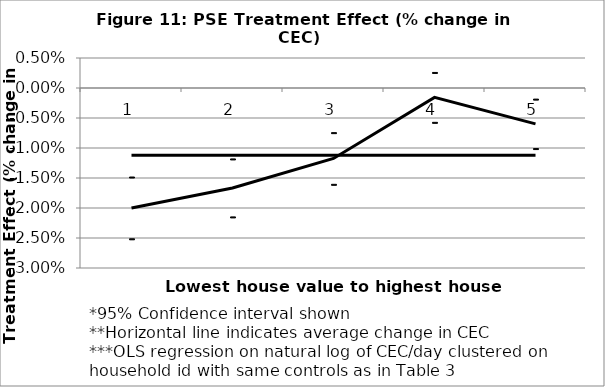
| Category | 1.721422 | 2 SD below | 2 SD above | Avg Reduction |
|---|---|---|---|---|
| 0 | -0.02 | -0.025 | -0.015 | -0.011 |
| 1 | -0.017 | -0.021 | -0.012 | -0.011 |
| 2 | -0.012 | -0.016 | -0.007 | -0.011 |
| 3 | -0.002 | -0.006 | 0.003 | -0.011 |
| 4 | -0.006 | -0.01 | -0.002 | -0.011 |